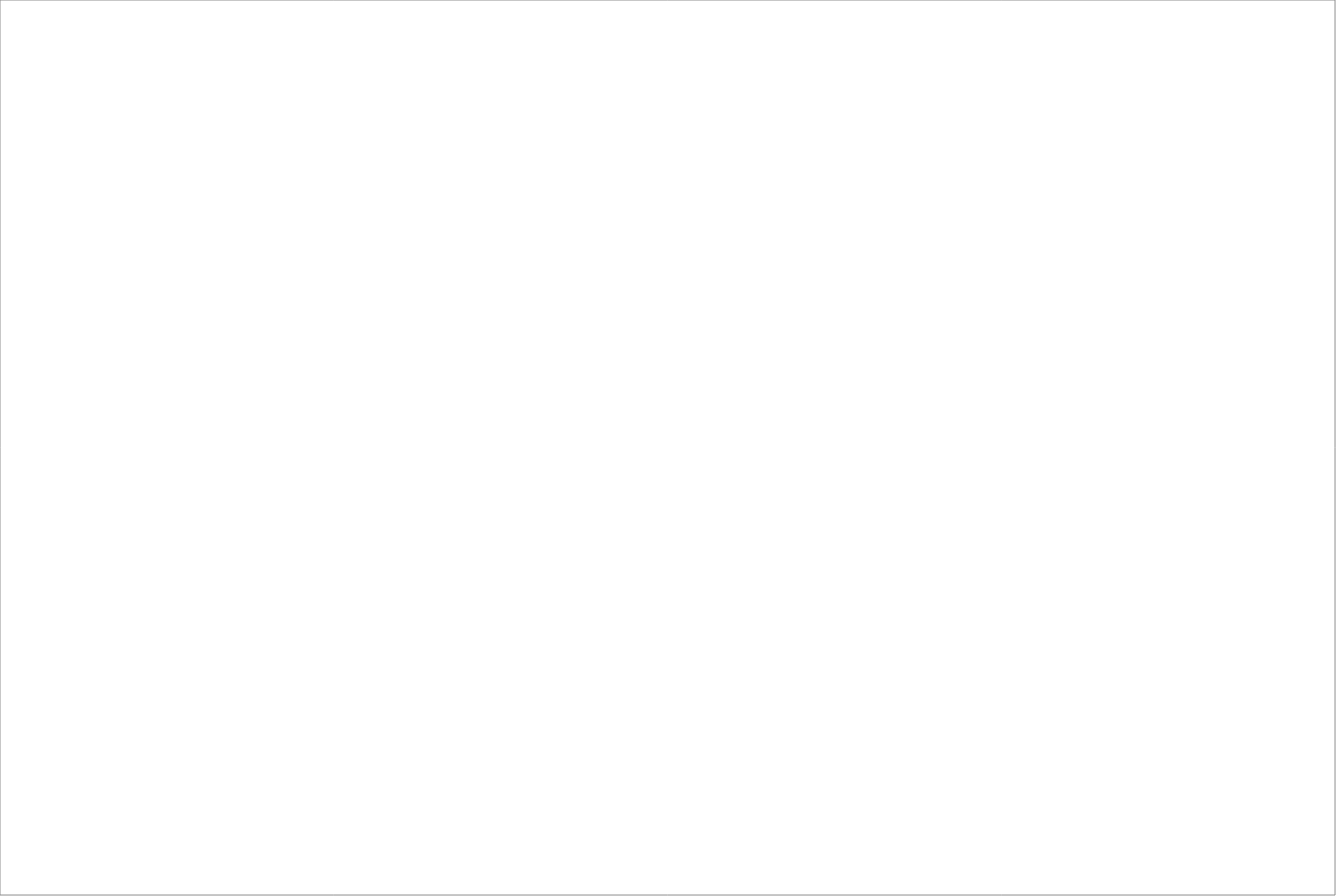
| Category | Total |
|---|---|
| Randstad AB | 77.5 |
| Poolia Sverige Aktiebolag | 65 |
| StudentConsulting Sweden AB | 65 |
| Academic Work Sweden AB | 62.5 |
| TROSS Sverige AB | 40 |